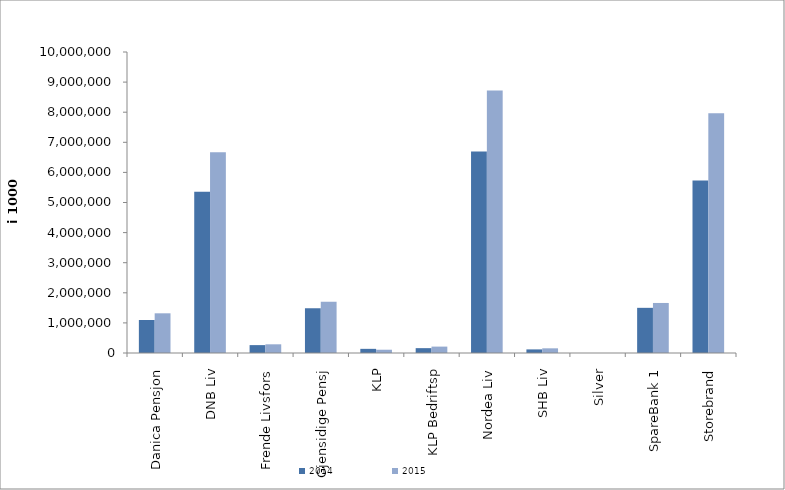
| Category | 2014 | 2015 |
|---|---|---|
| Danica Pensjon | 1097349.674 | 1318736.672 |
| DNB Liv | 5361212 | 6671259 |
| Frende Livsfors | 262080 | 288724 |
| Gjensidige Pensj | 1486777.231 | 1703498 |
| KLP | 138007.87 | 108686.046 |
| KLP Bedriftsp | 161211 | 212431 |
| Nordea Liv | 6697963 | 8718284.482 |
| SHB Liv | 119599 | 155206 |
| Silver | 5.9 | 14.594 |
| SpareBank 1 | 1500599.171 | 1662297.234 |
| Storebrand | 5727695.638 | 7963561.215 |